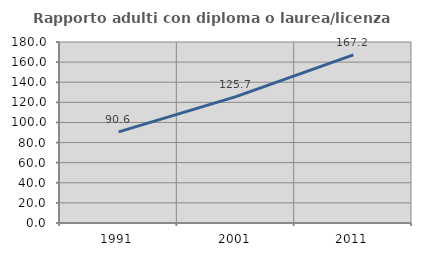
| Category | Rapporto adulti con diploma o laurea/licenza media  |
|---|---|
| 1991.0 | 90.603 |
| 2001.0 | 125.714 |
| 2011.0 | 167.197 |